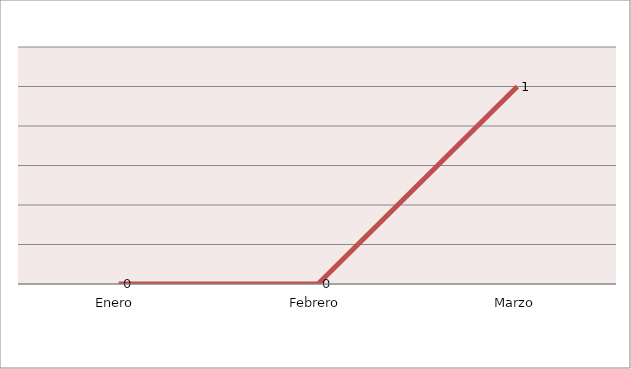
| Category | Series 0 |
|---|---|
| Enero  | 0 |
| Febrero | 0 |
| Marzo | 1 |